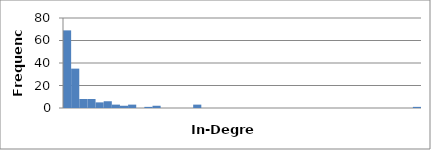
| Category | 69 |
|---|---|
| 0.0 | 69 |
| 2.604651162790698 | 35 |
| 5.209302325581396 | 8 |
| 7.813953488372094 | 8 |
| 10.418604651162791 | 5 |
| 13.02325581395349 | 6 |
| 15.627906976744189 | 3 |
| 18.232558139534888 | 2 |
| 20.837209302325586 | 3 |
| 23.441860465116285 | 0 |
| 26.046511627906984 | 1 |
| 28.651162790697683 | 2 |
| 31.25581395348838 | 0 |
| 33.86046511627908 | 0 |
| 36.465116279069775 | 0 |
| 39.06976744186047 | 0 |
| 41.674418604651166 | 3 |
| 44.27906976744186 | 0 |
| 46.883720930232556 | 0 |
| 49.48837209302325 | 0 |
| 52.09302325581395 | 0 |
| 54.69767441860464 | 0 |
| 57.30232558139534 | 0 |
| 59.90697674418603 | 0 |
| 62.51162790697673 | 0 |
| 65.11627906976743 | 0 |
| 67.72093023255813 | 0 |
| 70.32558139534883 | 0 |
| 72.93023255813954 | 0 |
| 75.53488372093024 | 0 |
| 78.13953488372094 | 0 |
| 80.74418604651164 | 0 |
| 83.34883720930235 | 0 |
| 85.95348837209305 | 0 |
| 88.55813953488375 | 0 |
| 91.16279069767445 | 0 |
| 93.76744186046515 | 0 |
| 96.37209302325586 | 0 |
| 98.97674418604656 | 0 |
| 101.58139534883726 | 0 |
| 104.18604651162796 | 0 |
| 106.79069767441867 | 0 |
| 109.39534883720937 | 0 |
| 112.0 | 1 |